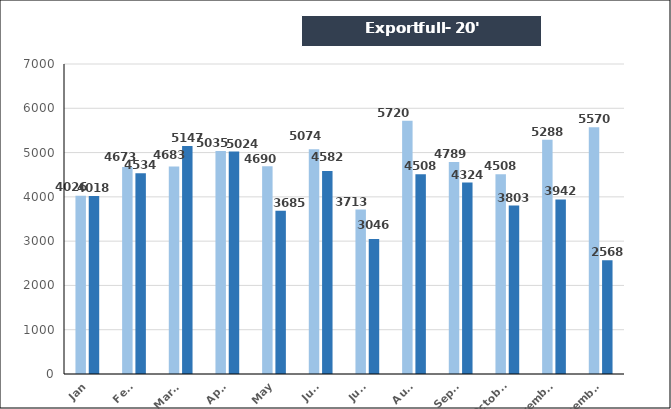
| Category | Export full - 20' |
|---|---|
| Jan | 4018 |
| Feb. | 4534 |
| March | 5147 |
| April | 5024 |
| May | 3685 |
| June | 4582 |
| July | 3046 |
| Aug. | 4508 |
| Sept. | 4324 |
| October | 3803 |
| November | 3942 |
| December | 2568 |